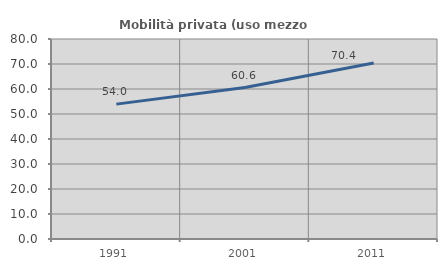
| Category | Mobilità privata (uso mezzo privato) |
|---|---|
| 1991.0 | 53.951 |
| 2001.0 | 60.565 |
| 2011.0 | 70.421 |